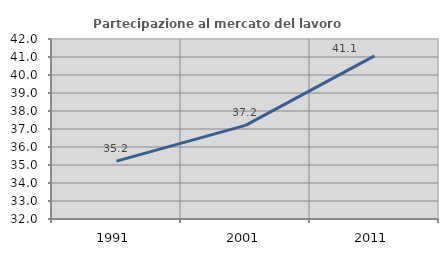
| Category | Partecipazione al mercato del lavoro  femminile |
|---|---|
| 1991.0 | 35.215 |
| 2001.0 | 37.204 |
| 2011.0 | 41.064 |